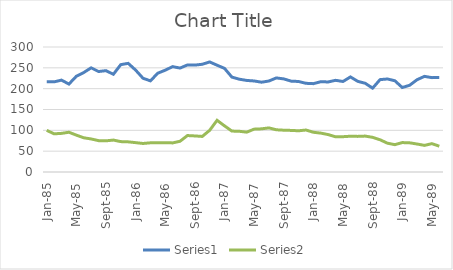
| Category | Series 0 | Series 2 |
|---|---|---|
| 1985-01-01 | 216.32 | 100 |
| 1985-02-01 | 216.32 | 91.62 |
| 1985-03-01 | 220.51 | 92.71 |
| 1985-04-01 | 210.98 | 95.41 |
| 1985-05-01 | 229.78 | 88.51 |
| 1985-06-01 | 238.74 | 82.1 |
| 1985-07-01 | 250.02 | 79.33 |
| 1985-08-01 | 241.12 | 75.26 |
| 1985-09-01 | 243.24 | 74.79 |
| 1985-10-01 | 234.53 | 76.61 |
| 1985-11-01 | 257.67 | 72.94 |
| 1985-12-01 | 260.77 | 72.34 |
| 1986-01-01 | 244.65 | 70.47 |
| 1986-02-01 | 225.01 | 68.47 |
| 1986-03-01 | 218.77 | 70.03 |
| 1986-04-01 | 237.15 | 70.44 |
| 1986-05-01 | 244.37 | 70.22 |
| 1986-06-01 | 252.87 | 69.85 |
| 1986-07-01 | 249.44 | 73.76 |
| 1986-08-01 | 256.88 | 87.5 |
| 1986-09-01 | 256.54 | 86.56 |
| 1986-10-01 | 258.52 | 85.36 |
| 1986-11-01 | 264.15 | 100.03 |
| 1986-12-01 | 256.29 | 124.11 |
| 1987-01-01 | 248.74 | 110.81 |
| 1987-02-01 | 227.74 | 98.21 |
| 1987-03-01 | 222.73 | 97.75 |
| 1987-04-01 | 219.74 | 95.63 |
| 1987-05-01 | 218.49 | 102.86 |
| 1987-06-01 | 215.52 | 103.59 |
| 1987-07-01 | 218.38 | 105.87 |
| 1987-08-01 | 225.76 | 101.31 |
| 1987-09-01 | 223.44 | 100.34 |
| 1987-10-01 | 218.09 | 99.82 |
| 1987-11-01 | 217.23 | 98.93 |
| 1987-12-01 | 212.85 | 100.73 |
| 1988-01-01 | 212.03 | 95.37 |
| 1988-02-01 | 216.68 | 93.32 |
| 1988-03-01 | 216.12 | 89.8 |
| 1988-04-01 | 220.05 | 84.46 |
| 1988-05-01 | 217.21 | 84.75 |
| 1988-06-01 | 228.15 | 85.86 |
| 1988-07-01 | 217.54 | 85.47 |
| 1988-08-01 | 212.91 | 86.2 |
| 1988-09-01 | 201.22 | 83.16 |
| 1988-10-01 | 221.67 | 77.38 |
| 1988-11-01 | 223.27 | 69.11 |
| 1988-12-01 | 218.98 | 65.61 |
| 1989-01-01 | 202.76 | 70.61 |
| 1989-02-01 | 208.14 | 70.02 |
| 1989-03-01 | 221.5 | 67.18 |
| 1989-04-01 | 229.52 | 63.88 |
| 1989-05-01 | 226.47 | 68.03 |
| 1989-06-01 | 227.11 | 61.93 |